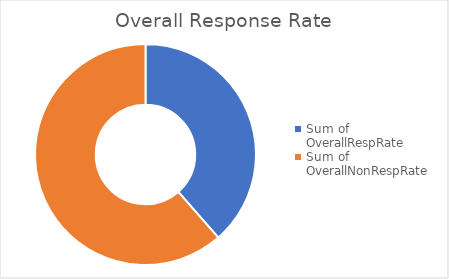
| Category | Total |
|---|---|
| Sum of OverallRespRate | 38.544 |
| Sum of OverallNonRespRate | 61.456 |